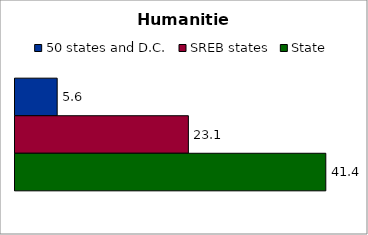
| Category | 50 states and D.C. | SREB states | State |
|---|---|---|---|
| 0 | 5.616 | 23.083 | 41.379 |